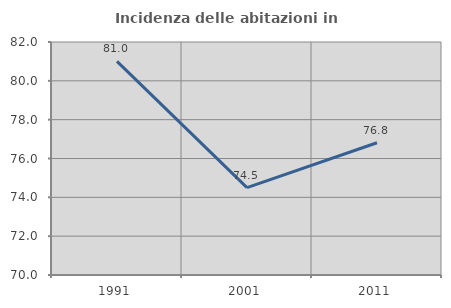
| Category | Incidenza delle abitazioni in proprietà  |
|---|---|
| 1991.0 | 81.003 |
| 2001.0 | 74.497 |
| 2011.0 | 76.812 |